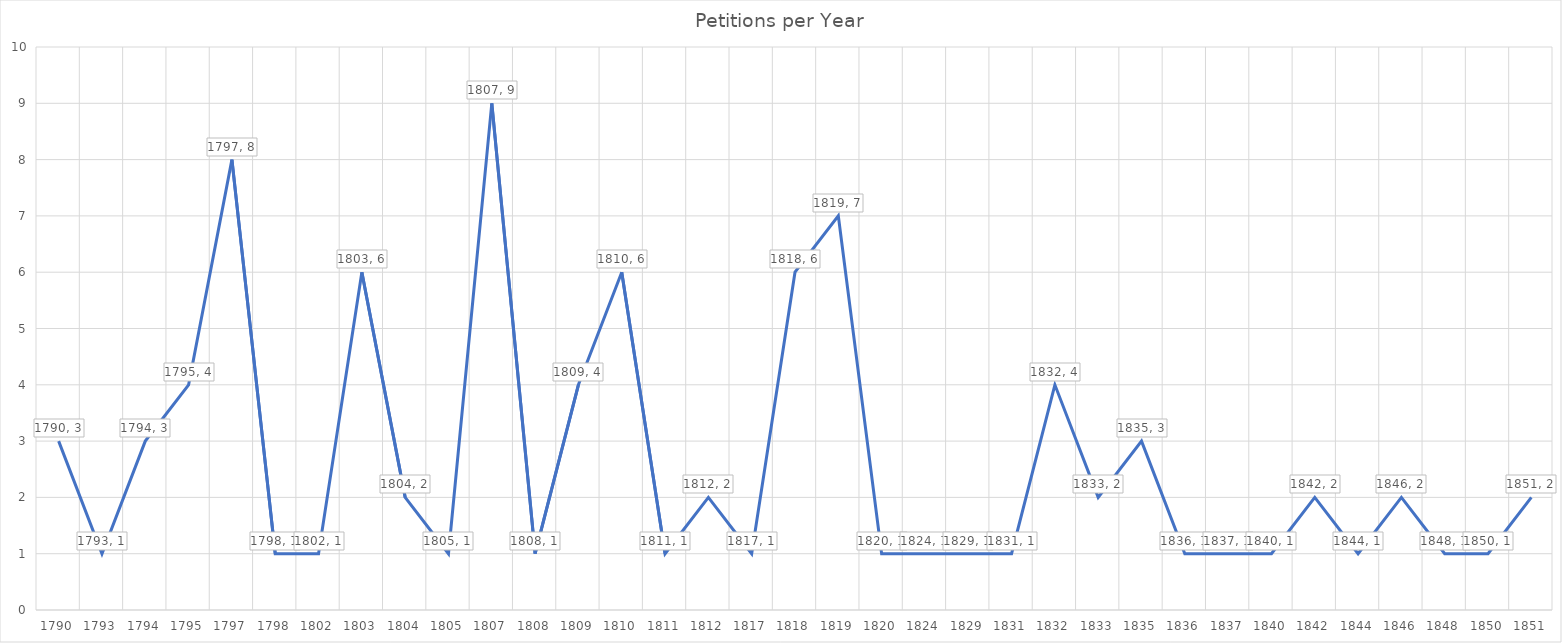
| Category | Total |
|---|---|
| 1790 | 3 |
| 1793 | 1 |
| 1794 | 3 |
| 1795 | 4 |
| 1797 | 8 |
| 1798 | 1 |
| 1802 | 1 |
| 1803 | 6 |
| 1804 | 2 |
| 1805 | 1 |
| 1807 | 9 |
| 1808 | 1 |
| 1809 | 4 |
| 1810 | 6 |
| 1811 | 1 |
| 1812 | 2 |
| 1817 | 1 |
| 1818 | 6 |
| 1819 | 7 |
| 1820 | 1 |
| 1824 | 1 |
| 1829 | 1 |
| 1831 | 1 |
| 1832 | 4 |
| 1833 | 2 |
| 1835 | 3 |
| 1836 | 1 |
| 1837 | 1 |
| 1840 | 1 |
| 1842 | 2 |
| 1844 | 1 |
| 1846 | 2 |
| 1848 | 1 |
| 1850 | 1 |
| 1851 | 2 |